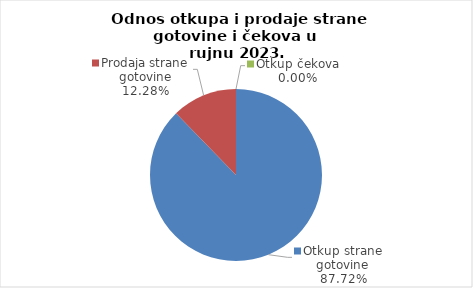
| Category | Series 0 |
|---|---|
| Otkup strane gotovine | 87.716 |
| Prodaja strane gotovine | 12.284 |
| Otkup čekova | 0 |